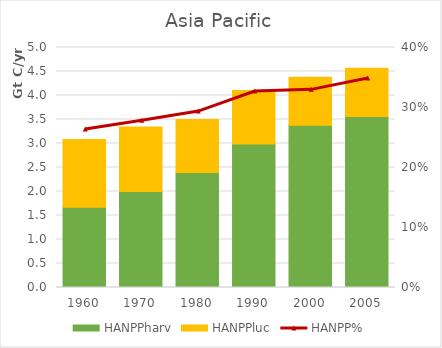
| Category | HANPPharv | HANPPluc |
|---|---|---|
| 1960.0 | 1669279.849 | 1413644.328 |
| 1970.0 | 1997668.176 | 1347990.968 |
| 1980.0 | 2393668.183 | 1108772.913 |
| 1990.0 | 2987352.295 | 1115551.119 |
| 2000.0 | 3382806.95 | 996046.817 |
| 2005.0 | 3563359.557 | 1005239.202 |